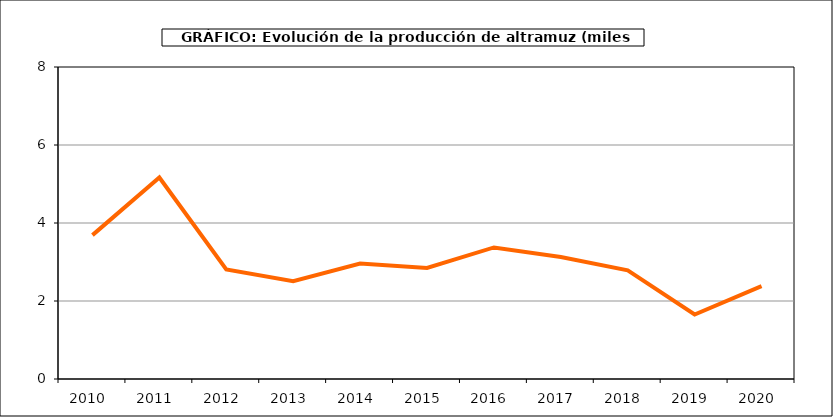
| Category | Producción |
|---|---|
| 2010.0 | 3.689 |
| 2011.0 | 5.166 |
| 2012.0 | 2.807 |
| 2013.0 | 2.508 |
| 2014.0 | 2.963 |
| 2015.0 | 2.847 |
| 2016.0 | 3.373 |
| 2017.0 | 3.127 |
| 2018.0 | 2.786 |
| 2019.0 | 1.653 |
| 2020.0 | 2.383 |